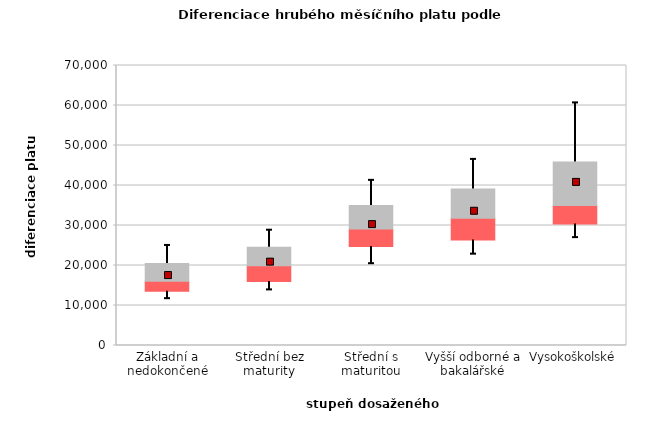
| Category | 0,25 | 0,5 | 0,75 |
|---|---|---|---|
| Základní a nedokončené | 13549.33 | 2502.67 | 4450.823 |
| Střední bez maturity | 16009.705 | 3937.708 | 4641.989 |
| Střední s maturitou | 24723.361 | 4375.014 | 5929.765 |
| Vyšší odborné a bakalářské | 26370.189 | 5471.323 | 7278.007 |
| Vysokoškolské | 30402.068 | 4577.74 | 10897.741 |